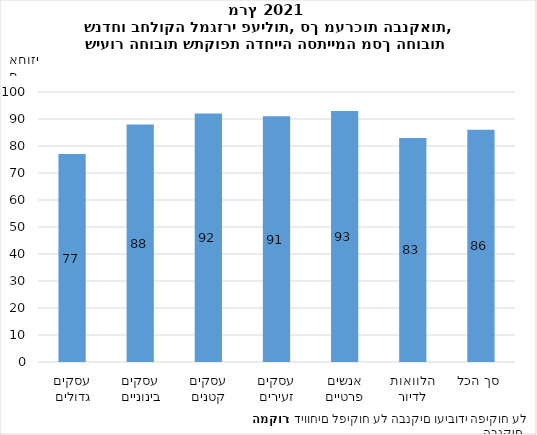
| Category | חובות אשר תקופת הדחייה הסתיימה |
|---|---|
| עסקים גדולים | 77 |
| עסקים בינוניים | 88 |
| עסקים קטנים | 92 |
| עסקים זעירים | 91 |
| אנשים פרטיים | 93 |
| הלוואות לדיור | 83 |
| סך הכל | 86 |